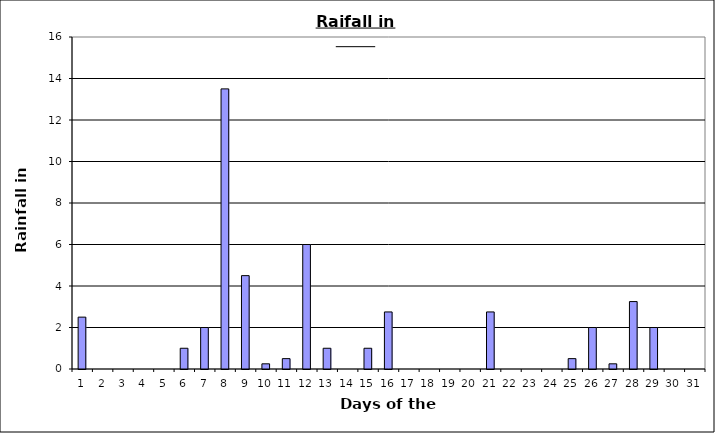
| Category | Series 0 |
|---|---|
| 0 | 2.5 |
| 1 | 0 |
| 2 | 0 |
| 3 | 0 |
| 4 | 0 |
| 5 | 1 |
| 6 | 2 |
| 7 | 13.5 |
| 8 | 4.5 |
| 9 | 0.25 |
| 10 | 0.5 |
| 11 | 6 |
| 12 | 1 |
| 13 | 0 |
| 14 | 1 |
| 15 | 2.75 |
| 16 | 0 |
| 17 | 0 |
| 18 | 0 |
| 19 | 0 |
| 20 | 2.75 |
| 21 | 0 |
| 22 | 0 |
| 23 | 0 |
| 24 | 0.5 |
| 25 | 2 |
| 26 | 0.25 |
| 27 | 3.25 |
| 28 | 2 |
| 29 | 0 |
| 30 | 0 |